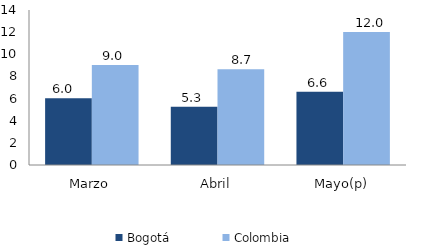
| Category | Bogotá | Colombia |
|---|---|---|
| Marzo | 6.031 | 9.021 |
| Abril | 5.263 | 8.651 |
| Mayo(p) | 6.605 | 12.015 |